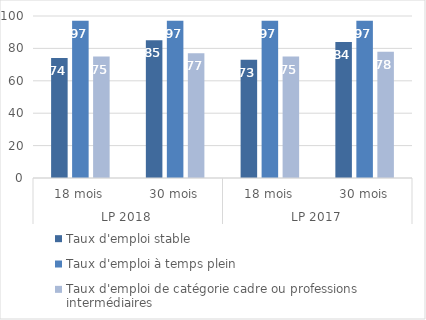
| Category | Taux d'emploi stable | Taux d'emploi à temps plein | Taux d'emploi de catégorie cadre ou professions intermédiaires |
|---|---|---|---|
| 0 | 74 | 97 | 75 |
| 1 | 85 | 97 | 77 |
| 2 | 73 | 97 | 75 |
| 3 | 84 | 97 | 78 |